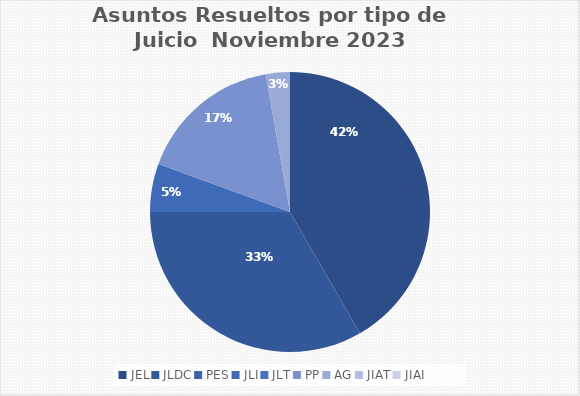
| Category | Asuntos Resueltos por tipo de Juicio  NOVIEMBRE |
|---|---|
| JEL | 15 |
| JLDC | 12 |
| PES | 0 |
| JLI | 2 |
| JLT | 0 |
| PP | 6 |
| AG | 1 |
| JIAT | 0 |
| JIAI | 0 |